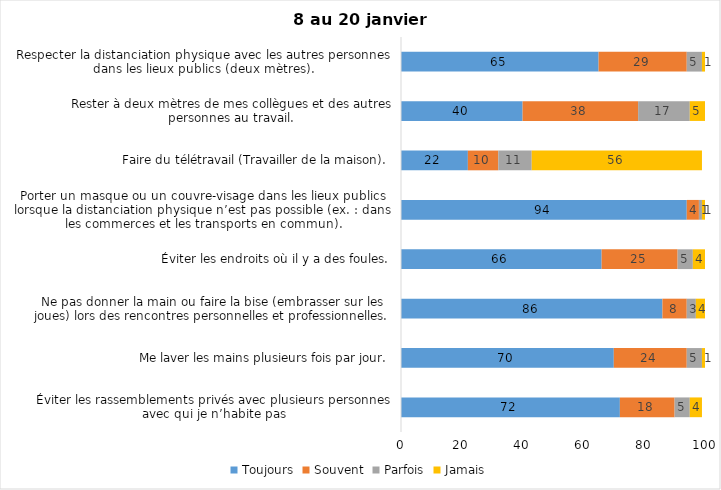
| Category | Toujours | Souvent | Parfois | Jamais |
|---|---|---|---|---|
| Éviter les rassemblements privés avec plusieurs personnes avec qui je n’habite pas | 72 | 18 | 5 | 4 |
| Me laver les mains plusieurs fois par jour. | 70 | 24 | 5 | 1 |
| Ne pas donner la main ou faire la bise (embrasser sur les joues) lors des rencontres personnelles et professionnelles. | 86 | 8 | 3 | 4 |
| Éviter les endroits où il y a des foules. | 66 | 25 | 5 | 4 |
| Porter un masque ou un couvre-visage dans les lieux publics lorsque la distanciation physique n’est pas possible (ex. : dans les commerces et les transports en commun). | 94 | 4 | 1 | 1 |
| Faire du télétravail (Travailler de la maison). | 22 | 10 | 11 | 56 |
| Rester à deux mètres de mes collègues et des autres personnes au travail. | 40 | 38 | 17 | 5 |
| Respecter la distanciation physique avec les autres personnes dans les lieux publics (deux mètres). | 65 | 29 | 5 | 1 |